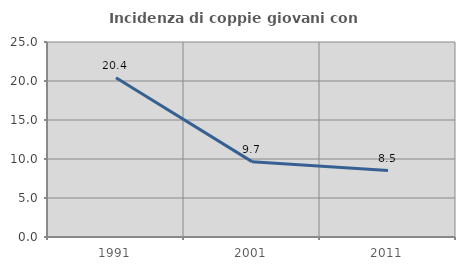
| Category | Incidenza di coppie giovani con figli |
|---|---|
| 1991.0 | 20.426 |
| 2001.0 | 9.661 |
| 2011.0 | 8.52 |